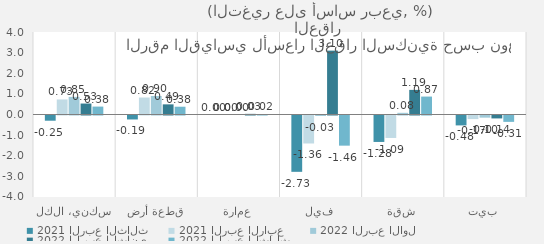
| Category | 2021 | 2022 |
|---|---|---|
| سكني، الكل | 0.729 | 0.384 |
| قطعة أرض | 0.823 | 0.377 |
| عمارة | 0 | 0.015 |
| فيلا | -1.357 | -1.462 |
| شقة | -1.089 | 0.869 |
| بيت | -0.174 | -0.309 |